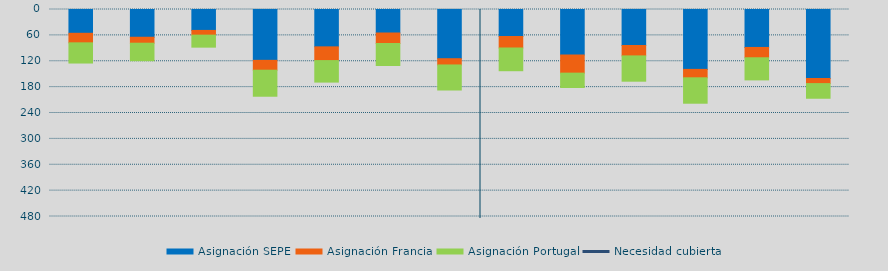
| Category | Asignación SEPE | Asignación Francia | Asignación Portugal |
|---|---|---|---|
| 0 | 55173.7 | 22114.9 | 46831.4 |
| 1 | 64347.4 | 13794.4 | 40614.3 |
| 2 | 48510.6 | 10931.6 | 27867.9 |
| 3 | 117881.4 | 22871.5 | 60380.5 |
| 4 | 86621.2 | 31842.2 | 49868.6 |
| 5 | 54505.3 | 24354.5 | 51005.7 |
| 6 | 114103.8 | 14504.8 | 58082.9 |
| 7 | 62612.7 | 26635.4 | 52718.7 |
| 8 | 105519.2 | 42049.8 | 33318.5 |
| 9 | 83466.2 | 24132.5 | 58650.9 |
| 10 | 138850.6 | 19527.1 | 58931.4 |
| 11 | 88000.9 | 23926.8 | 51284.5 |
| 12 | 159946.5 | 11873.6 | 33973.4 |